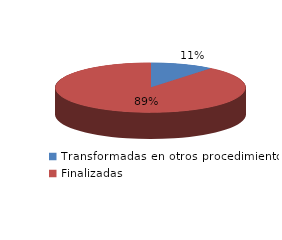
| Category | Series 0 |
|---|---|
| Transformadas en otros procedimientos | 469 |
| Finalizadas | 3898 |